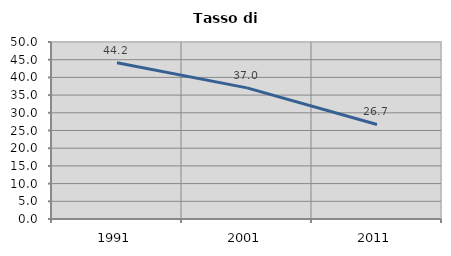
| Category | Tasso di disoccupazione   |
|---|---|
| 1991.0 | 44.166 |
| 2001.0 | 37.042 |
| 2011.0 | 26.708 |